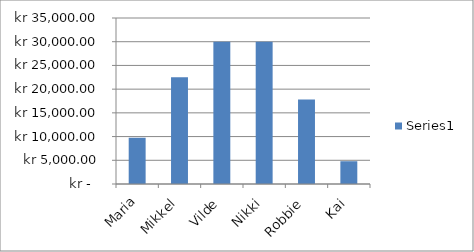
| Category | Series 0 |
|---|---|
| Maria | 9750 |
| Mikkel | 22500 |
| Vilde | 30000 |
| Nikki | 30000 |
| Robbie | 17800 |
| Kai | 4800 |